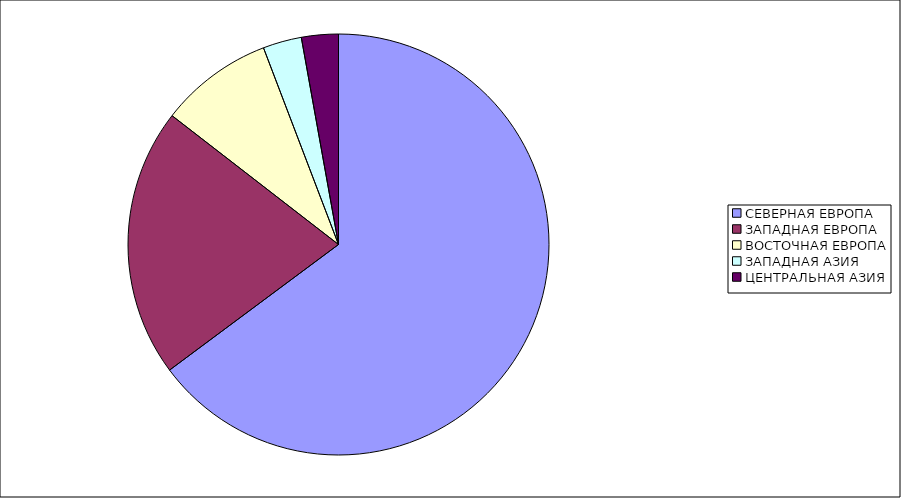
| Category | Оборот |
|---|---|
| СЕВЕРНАЯ ЕВРОПА | 64.824 |
| ЗАПАДНАЯ ЕВРОПА | 20.658 |
| ВОСТОЧНАЯ ЕВРОПА | 8.718 |
| ЗАПАДНАЯ АЗИЯ | 2.97 |
| ЦЕНТРАЛЬНАЯ АЗИЯ | 2.83 |